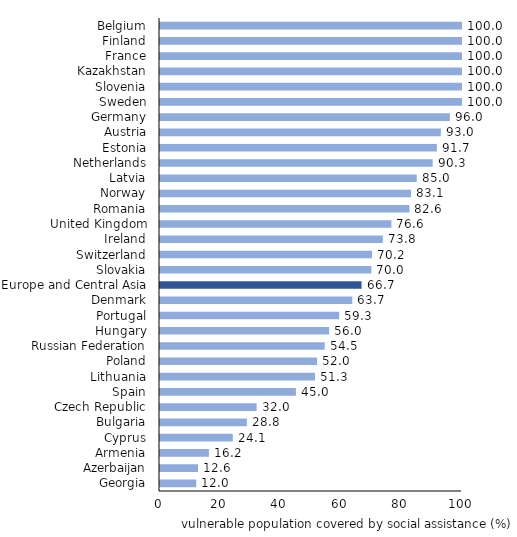
| Category | Vulnerable population covered by SP, % of total vulnerable population |
|---|---|
| Georgia | 12.001 |
| Azerbaijan | 12.585 |
| Armenia | 16.191 |
| Cyprus | 24.093 |
| Bulgaria | 28.76 |
| Czech Republic | 32 |
| Spain | 45 |
| Lithuania | 51.326 |
| Poland | 52 |
| Russian Federation | 54.537 |
| Hungary | 56 |
| Portugal | 59.31 |
| Denmark | 63.675 |
| Europe and Central Asia | 66.735 |
| Slovakia | 70 |
| Switzerland | 70.219 |
| Ireland | 73.793 |
| United Kingdom | 76.634 |
| Romania | 82.606 |
| Norway | 83.113 |
| Latvia | 85 |
| Netherlands | 90.278 |
| Estonia | 91.685 |
| Austria | 93 |
| Germany | 96 |
| Sweden | 100 |
| Slovenia | 100 |
| Kazakhstan | 100 |
| France | 100 |
| Finland | 100 |
| Belgium | 100 |